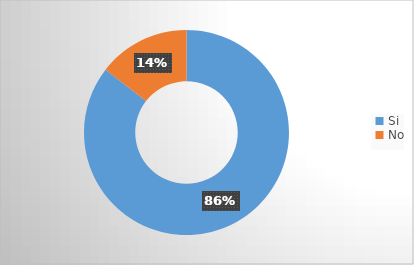
| Category | Series 0 |
|---|---|
| Si | 0.855 |
| No | 0.145 |